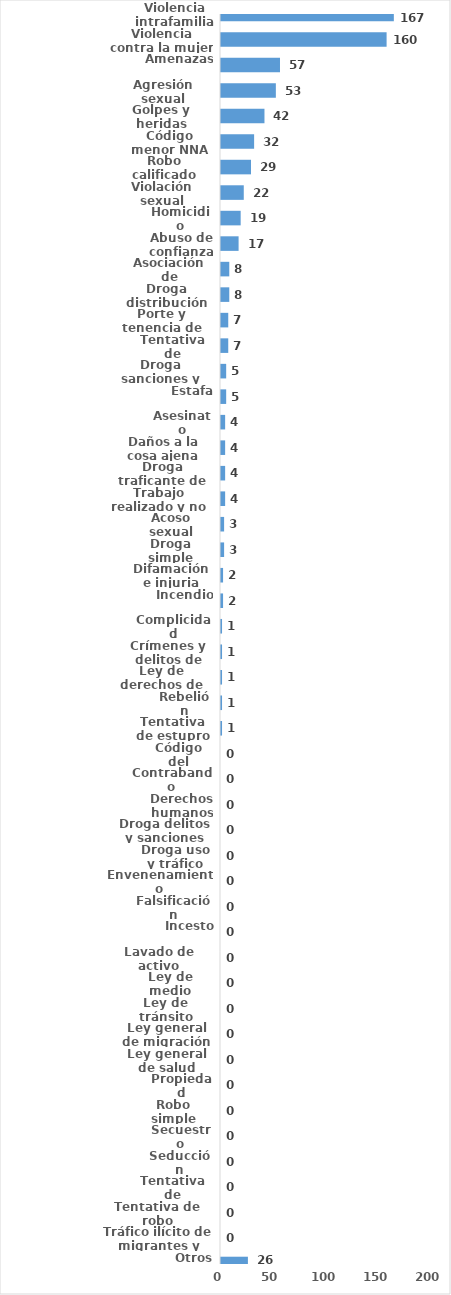
| Category | Series 0 |
|---|---|
| Violencia intrafamiliar | 167 |
| Violencia contra la mujer | 160 |
| Amenazas | 57 |
| Agresión sexual | 53 |
| Golpes y heridas | 42 |
| Código menor NNA | 32 |
| Robo calificado | 29 |
| Violación sexual | 22 |
| Homicidio | 19 |
| Abuso de confianza | 17 |
| Asociación de malhechores | 8 |
| Droga distribución de droga | 8 |
| Porte y tenencia de armas | 7 |
| Tentativa de homicidio | 7 |
| Droga sanciones y circunstancias agravantes | 5 |
| Estafa | 5 |
| Asesinato | 4 |
| Daños a la cosa ajena | 4 |
| Droga traficante de droga  | 4 |
| Trabajo realizado y no pagado | 4 |
| Acoso sexual | 3 |
| Droga simple posesión | 3 |
| Difamación e injuria | 2 |
| Incendio | 2 |
| Complicidad | 1 |
| Crímenes y delitos de alta tecnología | 1 |
| Ley de derechos de autor  | 1 |
| Rebelión | 1 |
| Tentativa de estupro | 1 |
| Código del trabajo | 0 |
| Contrabando | 0 |
| Derechos humanos | 0 |
| Droga delitos y sanciones | 0 |
| Droga uso y tráfico | 0 |
| Envenenamiento | 0 |
| Falsificación | 0 |
| Incesto | 0 |
| Lavado de activo | 0 |
| Ley de medio ambiente  | 0 |
| Ley de tránsito | 0 |
| Ley general de migración | 0 |
| Ley general de salud | 0 |
| Propiedad industrial  | 0 |
| Robo simple | 0 |
| Secuestro | 0 |
| Seducción | 0 |
| Tentativa de asesinato | 0 |
| Tentativa de robo | 0 |
| Tráfico ilícito de migrantes y trata de personas | 0 |
| Otros | 26 |